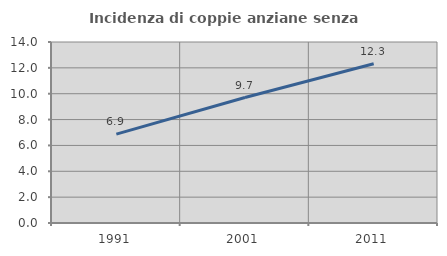
| Category | Incidenza di coppie anziane senza figli  |
|---|---|
| 1991.0 | 6.875 |
| 2001.0 | 9.706 |
| 2011.0 | 12.316 |